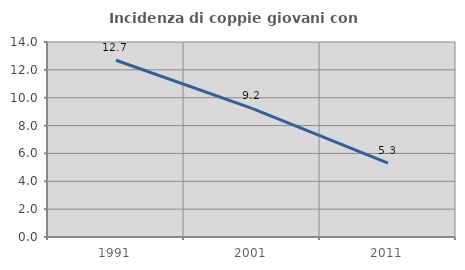
| Category | Incidenza di coppie giovani con figli |
|---|---|
| 1991.0 | 12.689 |
| 2001.0 | 9.231 |
| 2011.0 | 5.298 |